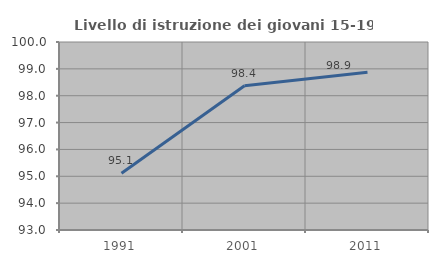
| Category | Livello di istruzione dei giovani 15-19 anni |
|---|---|
| 1991.0 | 95.111 |
| 2001.0 | 98.37 |
| 2011.0 | 98.87 |